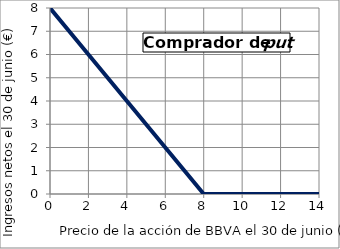
| Category | Comprador |
|---|---|
| 0.0 | 8 |
| 1.0 | 7 |
| 2.0 | 6 |
| 3.0 | 5 |
| 4.0 | 4 |
| 5.0 | 3 |
| 6.0 | 2 |
| 7.0 | 1 |
| 8.0 | 0 |
| 9.0 | 0 |
| 10.0 | 0 |
| 11.0 | 0 |
| 12.0 | 0 |
| 13.0 | 0 |
| 14.0 | 0 |